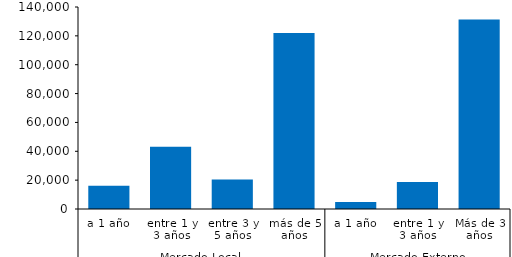
| Category | III |
|---|---|
| 0 | 16178.273 |
| 1 | 43157.448 |
| 2 | 20393.487 |
| 3 | 121932.524 |
| 4 | 4924.035 |
| 5 | 18793.88 |
| 6 | 131312.887 |